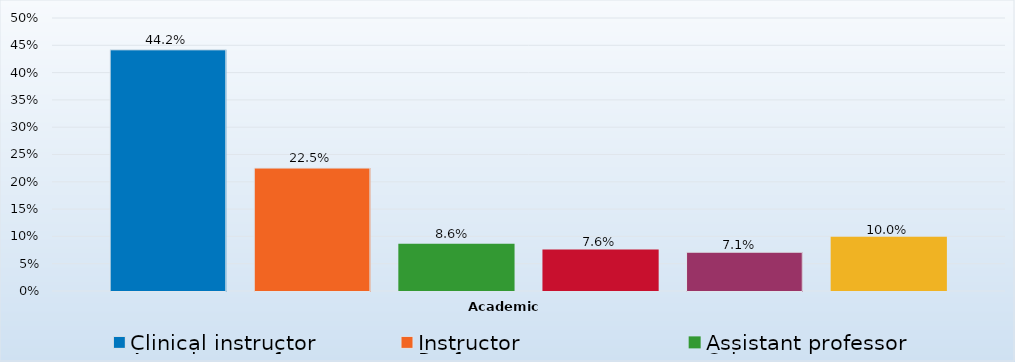
| Category | Clinical instructor | Instructor | Assistant professor | Associate professor | Professor | Other |
|---|---|---|---|---|---|---|
| 0 | 0.442 | 0.225 | 0.086 | 0.076 | 0.071 | 0.1 |